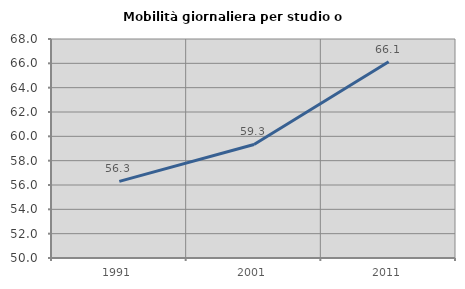
| Category | Mobilità giornaliera per studio o lavoro |
|---|---|
| 1991.0 | 56.295 |
| 2001.0 | 59.33 |
| 2011.0 | 66.137 |